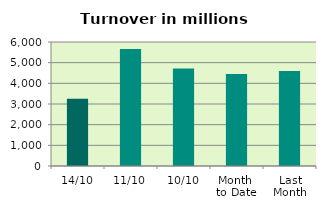
| Category | Series 0 |
|---|---|
| 14/10 | 3256.848 |
| 11/10 | 5661.719 |
| 10/10 | 4713.827 |
| Month 
to Date | 4453.426 |
| Last
Month | 4598.075 |